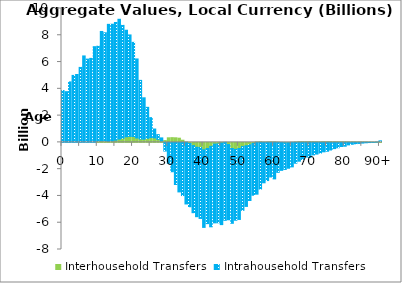
| Category | Interhousehold Transfers | Intrahousehold Transfers |
|---|---|---|
| 0 | 0 | 3872.87 |
|  | 0 | 3787.881 |
| 2 | 0 | 4519.856 |
| 3 | 0 | 5002.955 |
| 4 | 0 | 5071.654 |
| 5 | 0 | 5601.144 |
| 6 | 0 | 6457.478 |
| 7 | 0 | 6220.452 |
| 8 | 0 | 6274.897 |
| 9 | 0 | 7147.437 |
| 10 | 96.504 | 7085.791 |
| 11 | 122.849 | 8163.388 |
| 12 | 109.44 | 8077.437 |
| 13 | 77.671 | 8739.06 |
| 14 | 115.641 | 8708.537 |
| 15 | 165.723 | 8789.131 |
| 16 | 245.74 | 8948.571 |
| 17 | 309.41 | 8430.596 |
| 18 | 416.623 | 7960.267 |
| 19 | 447.976 | 7578.086 |
| 20 | 434.652 | 7036.325 |
| 21 | 332.603 | 5899.226 |
| 22 | 253.288 | 4378.505 |
| 23 | 242.756 | 3087.736 |
| 24 | 302.579 | 2315.854 |
| 25 | 359.82 | 1489.929 |
| 26 | 337.161 | 661.43 |
| 27 | 228.835 | 351.594 |
| 28 | 116.008 | 219.782 |
| 29 | 135.792 | -648.264 |
| 30 | 342.573 | -1567.932 |
| 31 | 353.167 | -2193.183 |
| 32 | 342.987 | -3143.983 |
| 33 | 313.963 | -3698.848 |
| 34 | 162.441 | -3971.205 |
| 35 | 25.826 | -4598.787 |
| 36 | -86.649 | -4720.052 |
| 37 | -240.503 | -5010.238 |
| 38 | -362.478 | -5186.933 |
| 39 | -376.682 | -5303.865 |
| 40 | -554.461 | -5795.288 |
| 41 | -457.019 | -5609.71 |
| 42 | -295.349 | -6010.036 |
| 43 | -126.233 | -5885.304 |
| 44 | -114.191 | -5892.382 |
| 45 | -43.906 | -6097.686 |
| 46 | 3.59 | -5822.342 |
| 47 | -163.416 | -5615.403 |
| 48 | -454.776 | -5589.554 |
| 49 | -522.109 | -5293.824 |
| 50 | -454.772 | -5301.315 |
| 51 | -309.879 | -4764.155 |
| 52 | -251.287 | -4530.824 |
| 53 | -177.679 | -4164.579 |
| 54 | -76.518 | -3870.744 |
| 55 | 29.074 | -3868.015 |
| 56 | 45.982 | -3480.702 |
| 57 | 20.899 | -3018.629 |
| 58 | 33.361 | -2851.306 |
| 59 | 37.859 | -2582.479 |
| 60 | 35.498 | -2726.171 |
| 61 | 17.475 | -2239.573 |
| 62 | -5.452 | -2082.809 |
| 63 | -26.24 | -1996.341 |
| 64 | -24.954 | -1904.18 |
| 65 | 3.701 | -1828.501 |
| 66 | 29.29 | -1557.175 |
| 67 | 50.469 | -1404.996 |
| 68 | 50.507 | -1278.306 |
| 69 | 47.587 | -1092.802 |
| 70 | 55.926 | -1132.47 |
| 71 | 48.581 | -934.383 |
| 72 | 43.804 | -873.808 |
| 73 | 42.042 | -795.981 |
| 74 | 46.627 | -705.507 |
| 75 | 50.808 | -661.508 |
| 76 | 50.836 | -568.262 |
| 77 | 46.53 | -465.219 |
| 78 | 46.167 | -401.004 |
| 79 | 40.845 | -306.595 |
| 80 | 46.143 | -286.686 |
| 81 | 37.242 | -186.129 |
| 82 | 37.514 | -142.403 |
| 83 | 36.212 | -104.321 |
| 84 | 36.818 | -79.289 |
| 85 | 35.301 | -53.184 |
| 86 | 30.506 | -29.112 |
| 87 | 25.853 | -12.049 |
| 88 | 21.852 | -0.466 |
| 89 | 17.829 | 7.108 |
| 90+ | 64.284 | 51.823 |